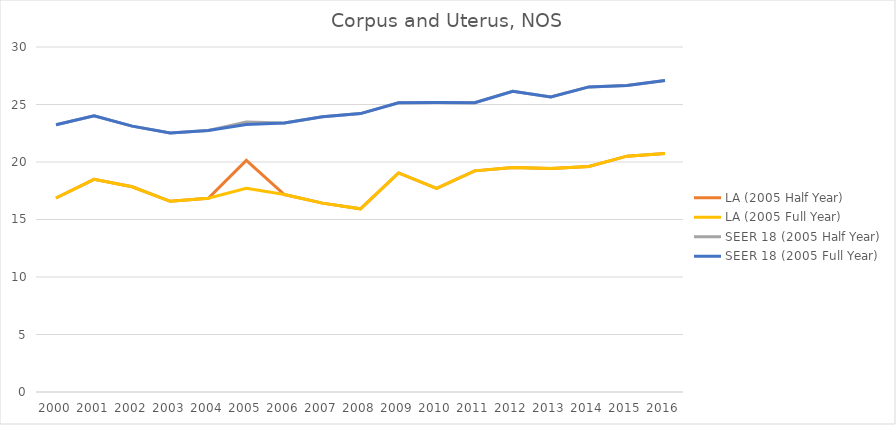
| Category | LA (2005 Half Year) | LA (2005 Full Year) | SEER 18 (2005 Half Year) | SEER 18 (2005 Full Year) |
|---|---|---|---|---|
| 2000.0 | 16.868 | 16.868 | 23.236 | 23.236 |
| 2001.0 | 18.488 | 18.488 | 24.011 | 24.011 |
| 2002.0 | 17.842 | 17.842 | 23.12 | 23.12 |
| 2003.0 | 16.584 | 16.584 | 22.531 | 22.531 |
| 2004.0 | 16.843 | 16.843 | 22.737 | 22.737 |
| 2005.0 | 20.141 | 17.705 | 23.48 | 23.25 |
| 2006.0 | 17.174 | 17.174 | 23.394 | 23.394 |
| 2007.0 | 16.424 | 16.424 | 23.935 | 23.935 |
| 2008.0 | 15.932 | 15.932 | 24.21 | 24.21 |
| 2009.0 | 19.047 | 19.047 | 25.154 | 25.154 |
| 2010.0 | 17.712 | 17.712 | 25.178 | 25.178 |
| 2011.0 | 19.231 | 19.231 | 25.151 | 25.151 |
| 2012.0 | 19.522 | 19.522 | 26.155 | 26.155 |
| 2013.0 | 19.437 | 19.437 | 25.659 | 25.659 |
| 2014.0 | 19.61 | 19.61 | 26.529 | 26.529 |
| 2015.0 | 20.51 | 20.51 | 26.659 | 26.659 |
| 2016.0 | 20.735 | 20.735 | 27.082 | 27.082 |